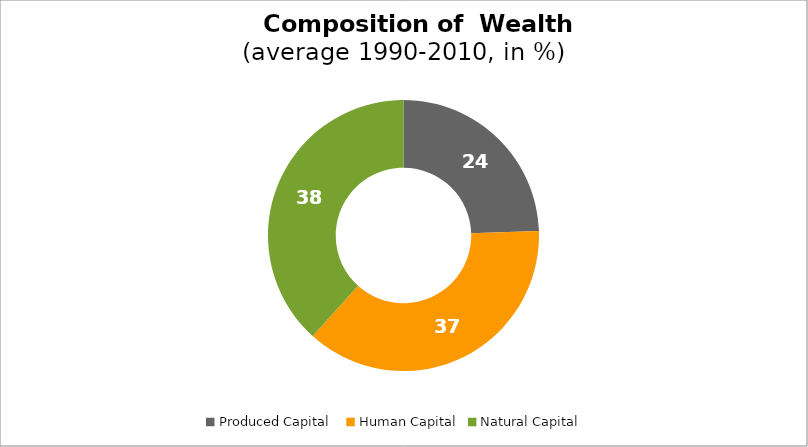
| Category | Series 0 |
|---|---|
| Produced Capital  | 24.483 |
| Human Capital | 37.215 |
| Natural Capital | 38.303 |